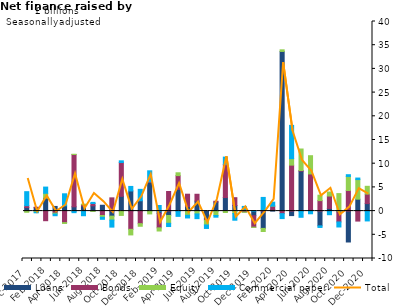
| Category | Loans | Bonds | Equity | Commercial paper |
|---|---|---|---|---|
| Dec-2017 | 0.765 | 0.379 | -0.249 | 2.954 |
| Jan-2018 | 0.731 | 0.093 | -0.241 | -0.116 |
| Feb-2018 | 2.742 | -2.027 | 1.015 | 1.309 |
| Mar-2018 | 0.985 | -0.433 | -0.186 | -0.357 |
| Apr-2018 | 1.118 | -2.435 | -0.173 | 2.532 |
| May-2018 | 0.905 | 11.031 | 0.056 | -0.33 |
| Jun-2018 | 1.067 | 0.294 | 0.102 | -0.977 |
| Jul-2018 | 1.113 | 0.494 | -0.066 | 0.233 |
| Aug-2018 | 1.234 | -0.932 | -0.369 | -0.431 |
| Sep-2018 | -1.063 | 2.795 | -0.83 | -1.484 |
| Oct-2018 | 3.107 | 7.138 | -0.912 | 0.363 |
| Nov-2018 | 4.248 | -3.846 | -1.178 | 0.958 |
| Dec-2018 | 2.182 | -2.65 | -0.55 | 2.407 |
| Jan-2019 | 6.026 | 0.161 | -0.592 | 2.312 |
| Feb-2019 | -0.452 | -3.084 | -0.662 | 1.181 |
| Mar-2019 | -0.92 | 4.131 | -1.654 | -0.683 |
| Apr-2019 | 4.569 | 2.92 | 0.595 | -1.109 |
| May-2019 | 0.945 | 2.622 | -0.888 | -0.561 |
| Jun-2019 | 2.115 | 1.437 | -0.591 | -1.001 |
| Jul-2019 | -1.676 | -0.281 | -0.96 | -0.742 |
| Aug-2019 | 1.909 | 0.174 | -0.926 | -0.357 |
| Sep-2019 | 2.861 | 6.981 | -0.298 | 1.548 |
| Oct-2019 | 1.177 | 1.651 | -0.509 | -1.416 |
| Nov-2019 | 0.337 | -0.195 | -0.054 | 0.654 |
| Dec-2019 | -0.974 | -2.415 | -0.043 | 0.031 |
| Jan-2020 | -3.649 | 0.155 | -0.661 | 2.731 |
| Feb-2020 | 0.283 | 0.764 | 0.013 | 0.826 |
| Mar-2020 | 33.685 | -0.54 | 0.339 | -1.041 |
| Apr-2020 | -0.948 | 9.698 | 1.375 | 7.014 |
| May-2020 | 8.434 | 0.131 | 4.535 | -1.303 |
| Jun-2020 | 0.349 | 7.494 | 3.843 | -0.564 |
| Jul-2020 | -3.11 | 2.212 | 1.14 | -0.34 |
| Aug-2020 | 0.565 | 2.614 | 0.841 | -0.762 |
| Sep-2020 | -0.17 | -2.122 | 3.691 | -1.058 |
| Oct-2020 | -6.517 | 4.349 | 2.963 | 0.366 |
| Nov-2020 | 2.514 | -2.106 | 4.133 | 0.327 |
| Dec-2020 | 1.582 | 2.015 | 1.635 | -2.076 |